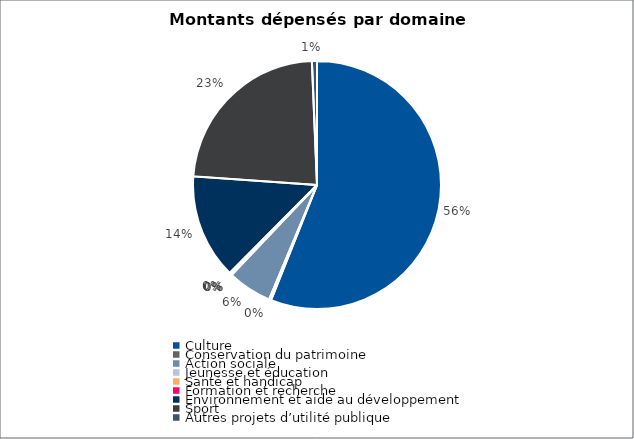
| Category | Series 0 |
|---|---|
| Culture | 20500000 |
| Conservation du patrimoine | 100000 |
| Action sociale | 2111000 |
| Jeunesse et éducation | 10000 |
| Santé et handicap | 30000 |
| Formation et recherche | 90000 |
| Environnement et aide au développement | 5000000 |
| Sport | 8500000 |
| Autres projets d’utilité publique | 240000 |